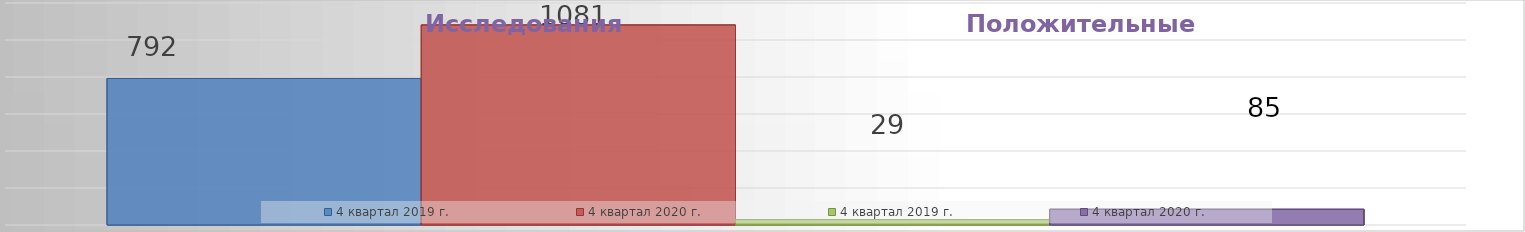
| Category | 4 квартал 2019 г. | 4 квартал 2020 г. |
|---|---|---|
| 0 | 29 | 85 |